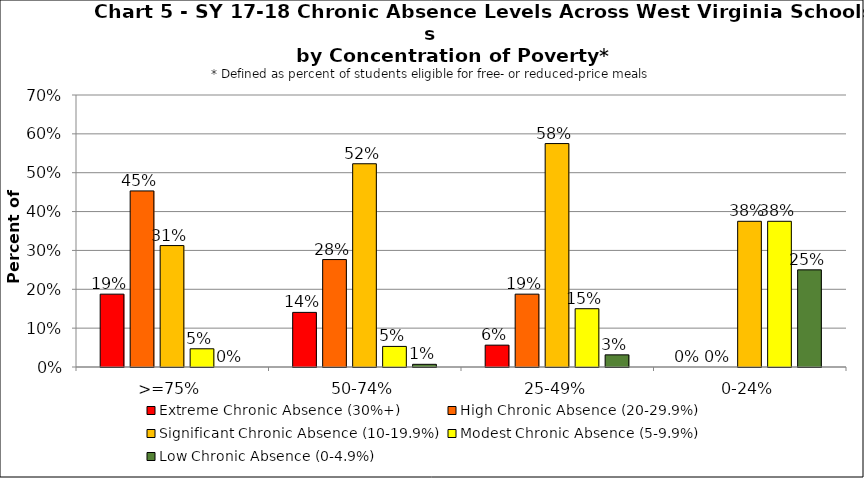
| Category | Extreme Chronic Absence (30%+) | High Chronic Absence (20-29.9%) | Significant Chronic Absence (10-19.9%) | Modest Chronic Absence (5-9.9%) | Low Chronic Absence (0-4.9%) |
|---|---|---|---|---|---|
| 0 | 0.188 | 0.453 | 0.312 | 0.047 | 0 |
| 1 | 0.141 | 0.276 | 0.523 | 0.053 | 0.007 |
| 2 | 0.056 | 0.188 | 0.575 | 0.15 | 0.031 |
| 3 | 0 | 0 | 0.375 | 0.375 | 0.25 |